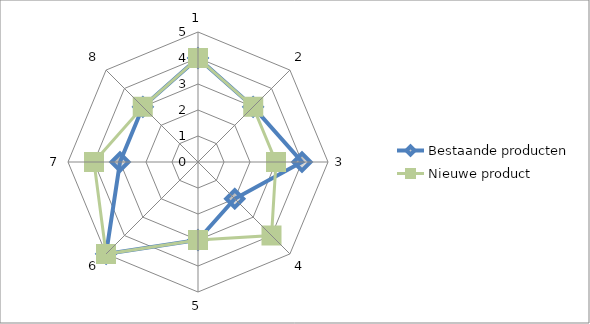
| Category | Bestaande producten | Nieuwe product |
|---|---|---|
| 0 | 4 | 4 |
| 1 | 3 | 3 |
| 2 | 4 | 3 |
| 3 | 2 | 4 |
| 4 | 3 | 3 |
| 5 | 5 | 5 |
| 6 | 3 | 4 |
| 7 | 3 | 3 |